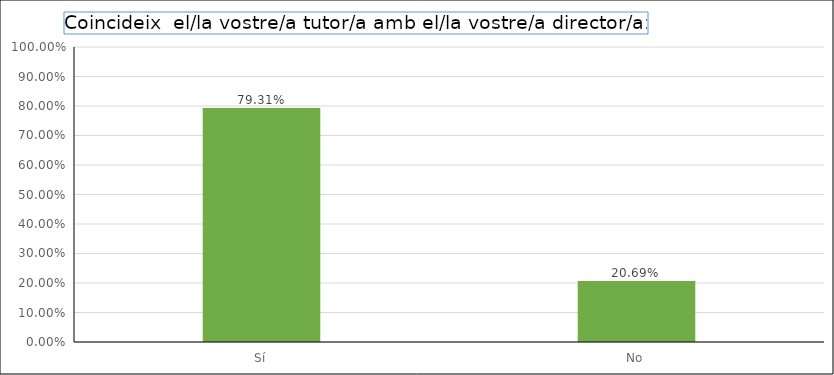
| Category | Series 0 |
|---|---|
| Sí | 0.793 |
| No | 0.207 |